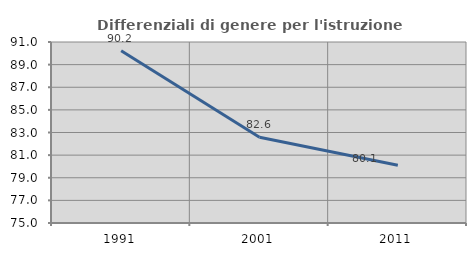
| Category | Differenziali di genere per l'istruzione superiore |
|---|---|
| 1991.0 | 90.226 |
| 2001.0 | 82.588 |
| 2011.0 | 80.098 |